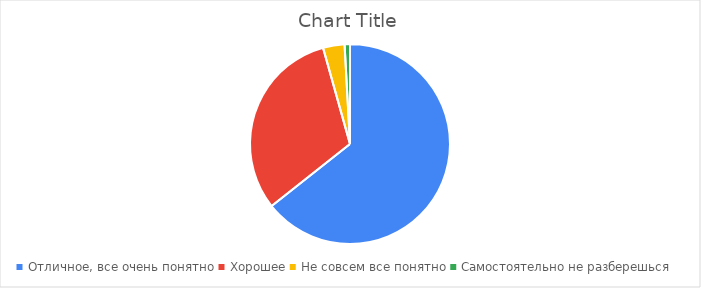
| Category | Series 0 |
|---|---|
| Отличное, все очень понятно | 74 |
| Хорошее | 36 |
| Не совсем все понятно | 4 |
| Самостоятельно не разберешься | 1 |